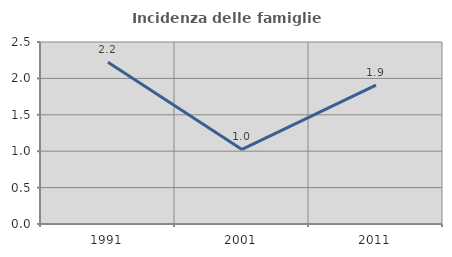
| Category | Incidenza delle famiglie numerose |
|---|---|
| 1991.0 | 2.222 |
| 2001.0 | 1.025 |
| 2011.0 | 1.907 |